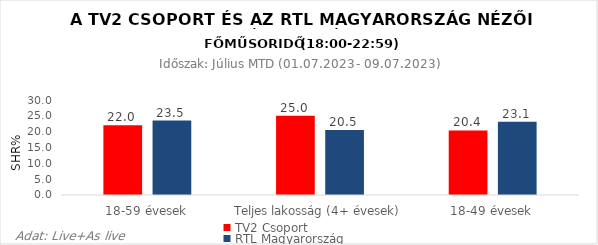
| Category | TV2 Csoport | RTL Magyarország |
|---|---|---|
| 18-59 évesek | 22 | 23.5 |
| Teljes lakosság (4+ évesek) | 25 | 20.5 |
| 18-49 évesek | 20.4 | 23.1 |